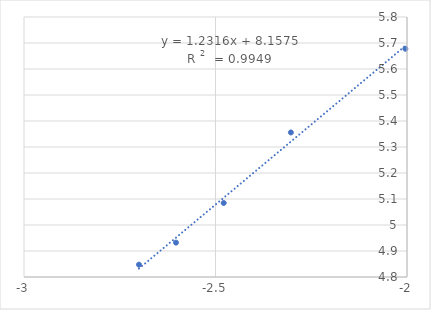
| Category | Series 0 |
|---|---|
| -2.0043213737826426 | 5.678 |
| -2.303196057420489 | 5.356 |
| -2.4785664955938436 | 5.085 |
| -2.603144372620182 | 4.932 |
| -2.699837725867246 | 4.847 |